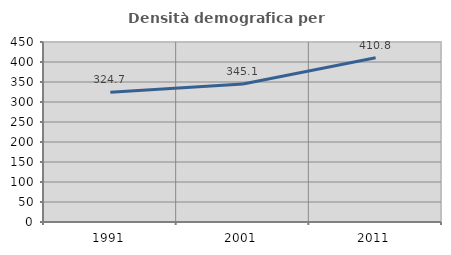
| Category | Densità demografica |
|---|---|
| 1991.0 | 324.658 |
| 2001.0 | 345.126 |
| 2011.0 | 410.829 |